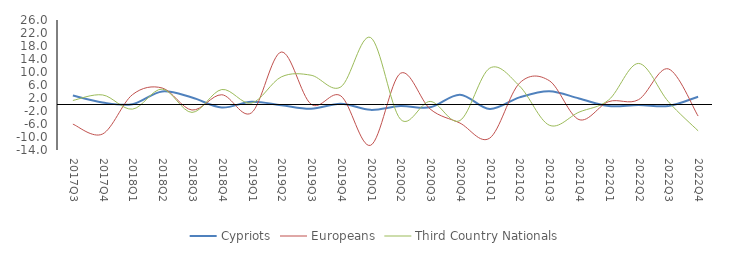
| Category | Cypriots | Europeans | Third Country Nationals |
|---|---|---|---|
| 2017Q3 | 2.76 | -6.051 | 1.245 |
| 2017Q4 | 0.611 | -9.065 | 2.94 |
| 2018Q1 | 0.102 | 3.027 | -1.426 |
| 2018Q2 | 4.023 | 5.079 | 4.742 |
| 2018Q3 | 2.13 | -1.698 | -2.439 |
| 2018Q4 | -0.92 | 3.002 | 4.61 |
| 2019Q1 | 0.847 | -2.551 | 0.424 |
| 2019Q2 | -0.212 | 16.147 | 8.492 |
| 2019Q3 | -1.307 | 0.095 | 9.007 |
| 2019Q4 | 0.246 | 2.642 | 5.414 |
| 2020Q1 | -1.648 | -12.551 | 20.599 |
| 2020Q2 | -0.459 | 9.585 | -4.501 |
| 2020Q3 | -0.868 | -1.397 | 0.948 |
| 2020Q4 | 3.026 | -5.709 | -4.94 |
| 2021Q1 | -1.383 | -10.349 | 11.181 |
| 2021Q2 | 2.188 | 6.564 | 5.695 |
| 2021Q3 | 4.07 | 7.34 | -6.362 |
| 2021Q4 | 1.853 | -4.645 | -2.354 |
| 2022Q1 | -0.481 | 0.899 | 1.427 |
| 2022Q2 | -0.126 | 1.492 | 12.634 |
| 2022Q3 | -0.463 | 10.962 | 0.885 |
| 2022Q4 | 2.39 | -3.557 | -8.097 |